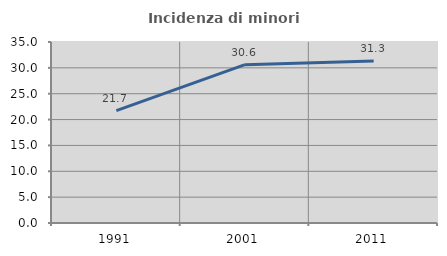
| Category | Incidenza di minori stranieri |
|---|---|
| 1991.0 | 21.739 |
| 2001.0 | 30.612 |
| 2011.0 | 31.313 |